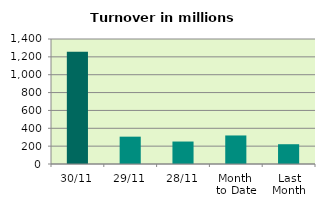
| Category | Series 0 |
|---|---|
| 30/11 | 1258.162 |
| 29/11 | 306.15 |
| 28/11 | 251.643 |
| Month 
to Date | 319.611 |
| Last
Month | 221.516 |